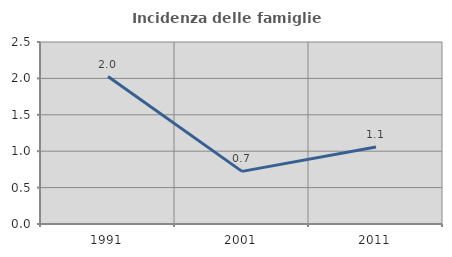
| Category | Incidenza delle famiglie numerose |
|---|---|
| 1991.0 | 2.025 |
| 2001.0 | 0.723 |
| 2011.0 | 1.057 |